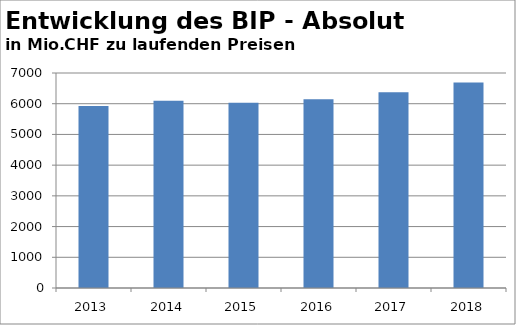
| Category | BIP |
|---|---|
| 2013.0 | 5924.5 |
| 2014.0 | 6099.3 |
| 2015.0 | 6032.7 |
| 2016.0 | 6146.2 |
| 2017.0 | 6375.2 |
| 2018.0 | 6688 |